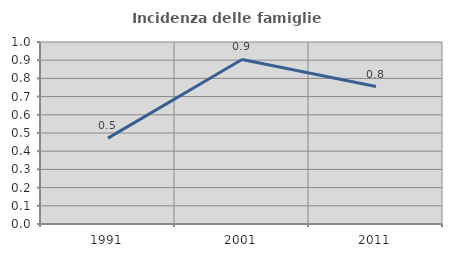
| Category | Incidenza delle famiglie numerose |
|---|---|
| 1991.0 | 0.472 |
| 2001.0 | 0.904 |
| 2011.0 | 0.755 |